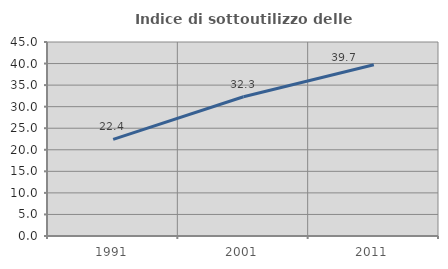
| Category | Indice di sottoutilizzo delle abitazioni  |
|---|---|
| 1991.0 | 22.418 |
| 2001.0 | 32.293 |
| 2011.0 | 39.711 |